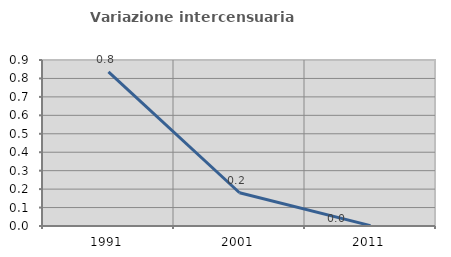
| Category | Variazione intercensuaria annua |
|---|---|
| 1991.0 | 0.836 |
| 2001.0 | 0.18 |
| 2011.0 | 0.002 |